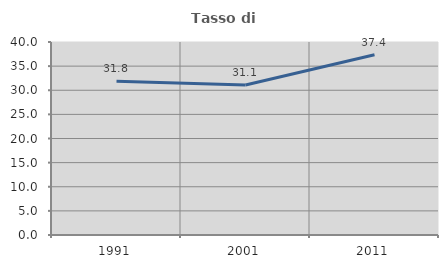
| Category | Tasso di occupazione   |
|---|---|
| 1991.0 | 31.843 |
| 2001.0 | 31.087 |
| 2011.0 | 37.373 |